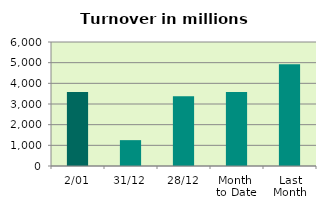
| Category | Series 0 |
|---|---|
| 2/01 | 3581.87 |
| 31/12 | 1251.304 |
| 28/12 | 3378.625 |
| Month 
to Date | 3581.87 |
| Last
Month | 4921.323 |